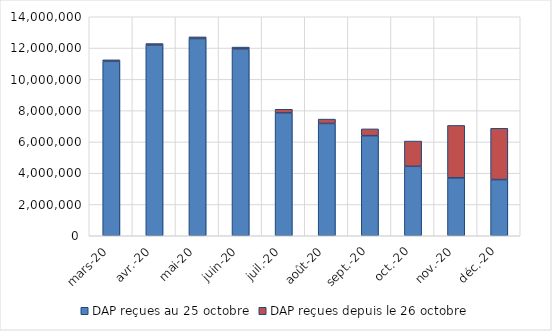
| Category | DAP reçues au 25 octobre | DAP reçues depuis le 26 octobre |
|---|---|---|
| 2020-03-01 | 11153277 | 93337 |
| 2020-04-01 | 12190505 | 97310 |
| 2020-05-01 | 12608930 | 104406 |
| 2020-06-01 | 11943923 | 116519 |
| 2020-07-01 | 7852037 | 234337 |
| 2020-08-01 | 7179045 | 278448 |
| 2020-09-01 | 6399097 | 432372 |
| 2020-10-01 | 4439393 | 1615097 |
| 2020-11-01 | 3702614 | 3351568 |
| 2020-12-01 | 3590154 | 3278813 |